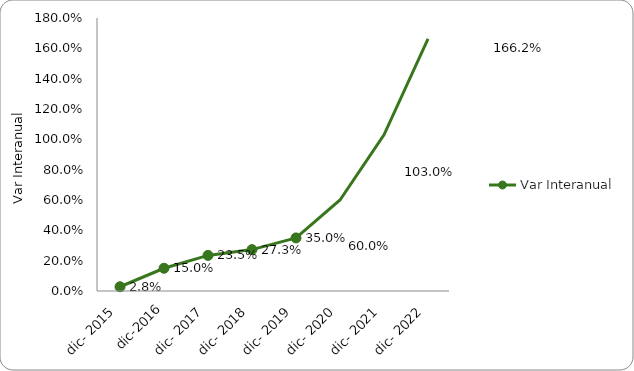
| Category | Var Interanual |
|---|---|
| dic- 2015 | 0.028 |
| dic-2016 | 0.15 |
| dic- 2017 | 0.235 |
| dic- 2018 | 0.273 |
| dic- 2019 | 0.35 |
| dic- 2020 | 0.6 |
| dic- 2021 | 1.03 |
| dic- 2022 | 1.662 |